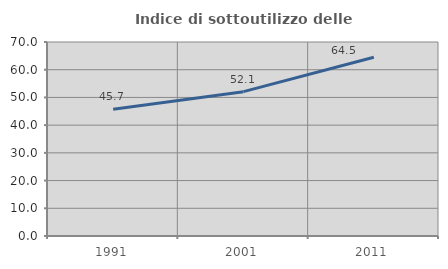
| Category | Indice di sottoutilizzo delle abitazioni  |
|---|---|
| 1991.0 | 45.721 |
| 2001.0 | 52.083 |
| 2011.0 | 64.493 |